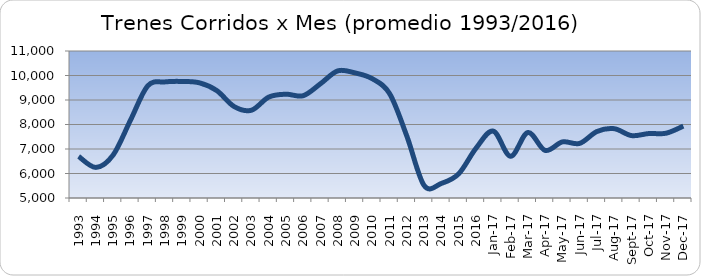
| Category | Series 0 |
|---|---|
| 1993.0 | 6696.75 |
| 1994.0 | 6247.833 |
| 1995.0 | 6757.333 |
| 1996.0 | 8174.5 |
| 1997.0 | 9578.25 |
| 1998.0 | 9738.917 |
| 1999.0 | 9756.833 |
| 2000.0 | 9700.083 |
| 2001.0 | 9382.083 |
| 2002.0 | 8732.5 |
| 2003.0 | 8581.917 |
| 2004.0 | 9117.417 |
| 2005.0 | 9236.917 |
| 2006.0 | 9176.333 |
| 2007.0 | 9665.667 |
| 2008.0 | 10189.667 |
| 2009.0 | 10105.25 |
| 2010.0 | 9866.833 |
| 2011.0 | 9259 |
| 2012.0 | 7517.667 |
| 2013.0 | 5506.833 |
| 2014.0 | 5597.25 |
| 2015.0 | 5989.083 |
| 2016.0 | 7032.167 |
| 42736.0 | 7729 |
| 42767.0 | 6703 |
| 42795.0 | 7674 |
| 42826.0 | 6942 |
| 42856.0 | 7290 |
| 42887.0 | 7229 |
| 42917.0 | 7715 |
| 42948.0 | 7829 |
| 42979.0 | 7547 |
| 43009.0 | 7631 |
| 43040.0 | 7644 |
| 43070.0 | 7934 |